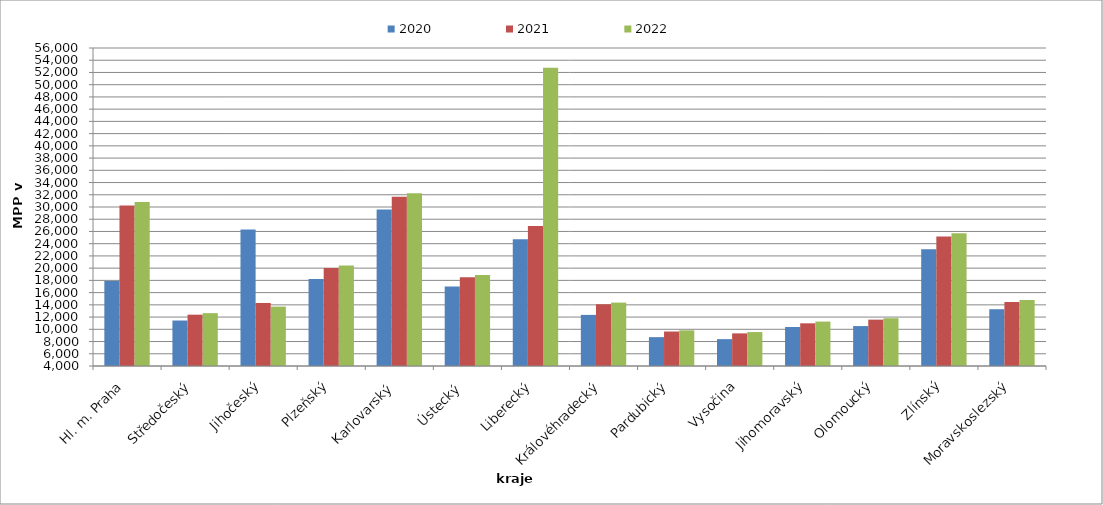
| Category | 2020 | 2021 | 2022 |
|---|---|---|---|
| Hl. m. Praha | 17896.127 | 30242.815 | 30826.979 |
| Středočeský | 11437.714 | 12393.089 | 12641.041 |
| Jihočeský | 26312.105 | 14307.025 | 13711.97 |
| Plzeňský | 18211.134 | 20032.345 | 20433.157 |
| Karlovarský  | 29600 | 31680 | 32240 |
| Ústecký   | 17000.435 | 18530.318 | 18900.913 |
| Liberecký | 24745.275 | 26885.263 | 52778.71 |
| Královéhradecký | 12356.255 | 14086.59 | 14368.288 |
| Pardubický | 8717.297 | 9638.914 | 9831.85 |
| Vysočina | 8392.495 | 9334.496 | 9549.108 |
| Jihomoravský | 10375.491 | 10981.179 | 11262.243 |
| Olomoucký | 10529.429 | 11582.286 | 11814 |
| Zlínský | 23096.467 | 25185.836 | 25689.553 |
| Moravskoslezský | 13284.552 | 14476.756 | 14783.322 |